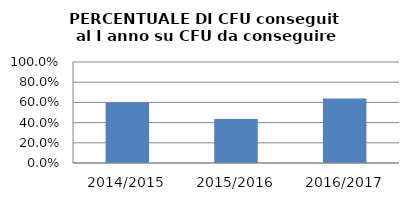
| Category | 2014/2015 2015/2016 2016/2017 |
|---|---|
| 2014/2015 | 0.598 |
| 2015/2016 | 0.436 |
| 2016/2017 | 0.638 |